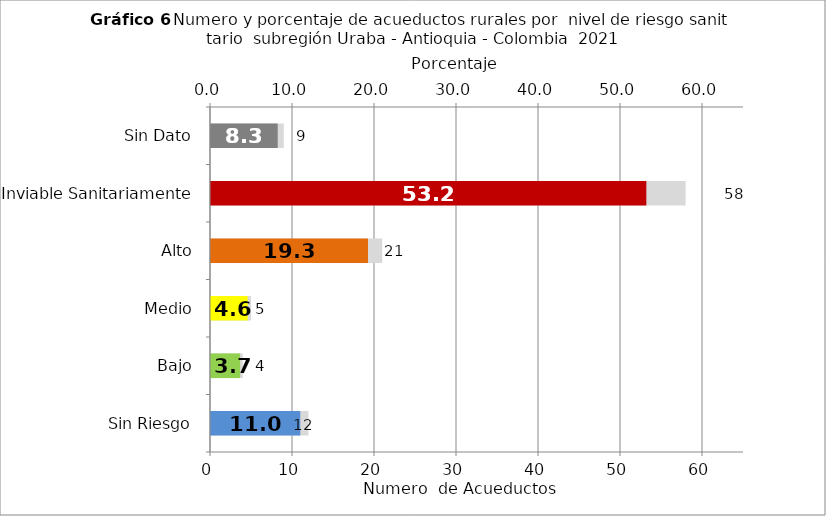
| Category | Número de Sistemas |
|---|---|
| Sin Riesgo | 12 |
| Bajo | 4 |
| Medio | 5 |
| Alto | 21 |
| Inviable Sanitariamente | 58 |
| Sin Dato | 9 |